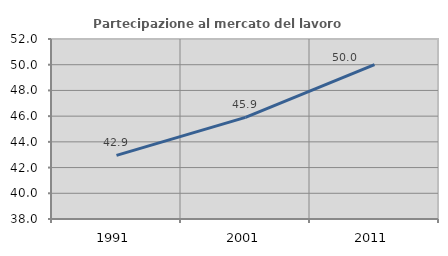
| Category | Partecipazione al mercato del lavoro  femminile |
|---|---|
| 1991.0 | 42.95 |
| 2001.0 | 45.907 |
| 2011.0 | 50.015 |